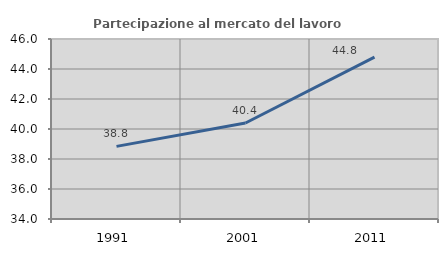
| Category | Partecipazione al mercato del lavoro  femminile |
|---|---|
| 1991.0 | 38.842 |
| 2001.0 | 40.401 |
| 2011.0 | 44.795 |